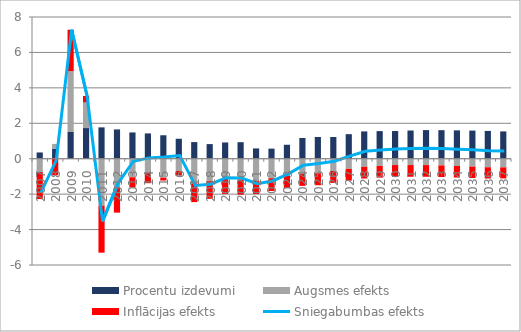
| Category | Procentu izdevumi | Augsmes efekts | Inflācijas efekts |
|---|---|---|---|
| 0 | 0.353 | -0.754 | -1.527 |
| 1 | 0.551 | 0.285 | -0.933 |
| 2 | 1.511 | 3.434 | 2.337 |
| 3 | 1.731 | 1.442 | 0.368 |
| 4 | 1.77 | -2.65 | -2.655 |
| 5 | 1.655 | -1.594 | -1.45 |
| 6 | 1.483 | -1.047 | -0.579 |
| 7 | 1.428 | -0.798 | -0.585 |
| 8 | 1.324 | -1.075 | -0.157 |
| 9 | 1.127 | -0.694 | -0.255 |
| 10 | 0.938 | -1.39 | -1.06 |
| 11 | 0.825 | -1.245 | -1.018 |
| 12 | 0.918 | -1.135 | -0.853 |
| 13 | 0.933 | -1.17 | -0.858 |
| 14 | 0.581 | -1.245 | -0.748 |
| 15 | 0.569 | -1.1 | -0.724 |
| 16 | 0.788 | -0.953 | -0.702 |
| 17 | 1.169 | -0.847 | -0.686 |
| 18 | 1.225 | -0.82 | -0.676 |
| 19 | 1.226 | -0.695 | -0.669 |
| 20 | 1.385 | -0.573 | -0.663 |
| 21 | 1.541 | -0.456 | -0.661 |
| 22 | 1.558 | -0.407 | -0.662 |
| 23 | 1.563 | -0.358 | -0.662 |
| 24 | 1.591 | -0.357 | -0.662 |
| 25 | 1.616 | -0.36 | -0.66 |
| 26 | 1.612 | -0.378 | -0.657 |
| 27 | 1.6 | -0.41 | -0.651 |
| 28 | 1.587 | -0.444 | -0.644 |
| 29 | 1.569 | -0.482 | -0.634 |
| 30 | 1.541 | -0.489 | -0.623 |